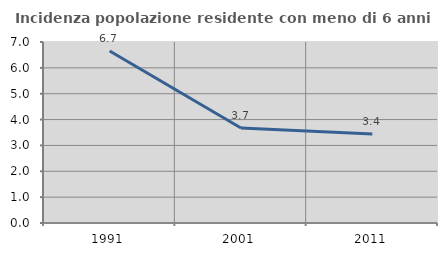
| Category | Incidenza popolazione residente con meno di 6 anni |
|---|---|
| 1991.0 | 6.653 |
| 2001.0 | 3.676 |
| 2011.0 | 3.438 |